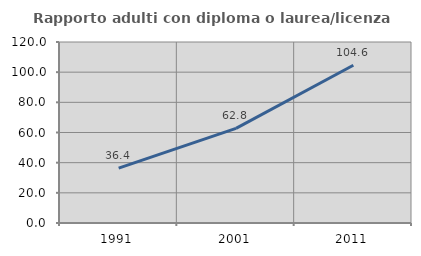
| Category | Rapporto adulti con diploma o laurea/licenza media  |
|---|---|
| 1991.0 | 36.364 |
| 2001.0 | 62.771 |
| 2011.0 | 104.587 |